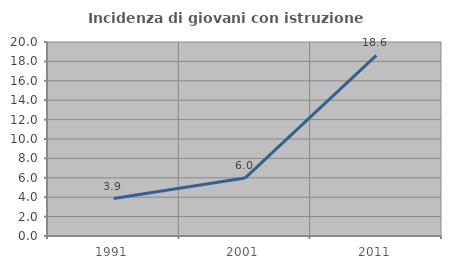
| Category | Incidenza di giovani con istruzione universitaria |
|---|---|
| 1991.0 | 3.859 |
| 2001.0 | 5.974 |
| 2011.0 | 18.621 |